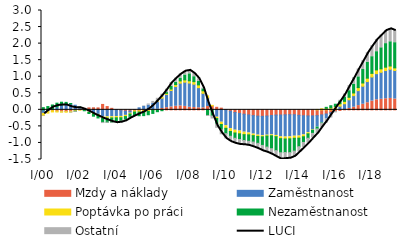
| Category | Mzdy a náklady | Zaměstnanost | Poptávka po práci | Nezaměstnanost | Ostatní |
|---|---|---|---|---|---|
| I/00 | -0.017 | -0.091 | -0.065 | 0.066 | -0.016 |
| II | -0.021 | -0.03 | -0.048 | 0.099 | -0.005 |
| III | -0.028 | 0.031 | -0.035 | 0.115 | 0.001 |
| IV | -0.037 | 0.092 | -0.029 | 0.11 | -0.005 |
| I/01 | -0.046 | 0.15 | -0.025 | 0.081 | -0.014 |
| II | -0.049 | 0.188 | -0.023 | 0.037 | -0.008 |
| III | -0.045 | 0.177 | -0.022 | 0.014 | -0.031 |
| IV | -0.022 | 0.139 | -0.016 | -0.007 | -0.029 |
| I/02 | 0.016 | 0.057 | -0.008 | 0.008 | -0.013 |
| II | 0.043 | -0.012 | -0.007 | -0.009 | -0.002 |
| III | 0.059 | -0.069 | -0.009 | -0.034 | 0.005 |
| IV | 0.063 | -0.11 | -0.016 | -0.065 | 0.006 |
| I/03 | 0.058 | -0.139 | -0.023 | -0.083 | -0.001 |
| II | 0.163 | -0.212 | -0.046 | -0.122 | -0.034 |
| III | 0.099 | -0.212 | -0.04 | -0.124 | -0.03 |
| IV | 0.045 | -0.21 | -0.036 | -0.128 | -0.026 |
| I/04 | 0.003 | -0.203 | -0.038 | -0.116 | -0.034 |
| II | -0.025 | -0.174 | -0.041 | -0.098 | -0.035 |
| III | -0.039 | -0.129 | -0.037 | -0.094 | -0.03 |
| IV | -0.039 | -0.065 | -0.025 | -0.096 | -0.023 |
| I/05 | -0.034 | 0.008 | -0.032 | -0.105 | -0.015 |
| II | -0.031 | 0.061 | -0.035 | -0.112 | 0.001 |
| III | -0.026 | 0.103 | -0.038 | -0.111 | 0.016 |
| IV | -0.016 | 0.141 | -0.032 | -0.101 | 0.036 |
| I/06 | 0.002 | 0.189 | -0.011 | -0.098 | 0.063 |
| II | 0.017 | 0.242 | 0.007 | -0.056 | 0.082 |
| III | 0.04 | 0.314 | 0.022 | -0.026 | 0.096 |
| IV | 0.065 | 0.4 | 0.034 | 0.022 | 0.105 |
| I/07 | 0.088 | 0.495 | 0.045 | 0.079 | 0.114 |
| II | 0.108 | 0.596 | 0.059 | 0.072 | 0.124 |
| III | 0.118 | 0.687 | 0.068 | 0.084 | 0.124 |
| IV | 0.104 | 0.732 | 0.068 | 0.149 | 0.116 |
| I/08 | 0.078 | 0.731 | 0.068 | 0.21 | 0.104 |
| II | 0.069 | 0.705 | 0.078 | 0.149 | 0.092 |
| III | 0.061 | 0.608 | 0.083 | 0.114 | 0.072 |
| IV | 0.061 | 0.439 | 0.076 | 0.058 | 0.025 |
| I/09 | 0.1 | 0.26 | 0.062 | -0.17 | -0.031 |
| II | 0.104 | 0.018 | 0.013 | -0.185 | -0.092 |
| III | 0.076 | -0.222 | -0.041 | -0.162 | -0.133 |
| IV | 0.051 | -0.374 | -0.068 | -0.16 | -0.151 |
| I/10 | 0.01 | -0.478 | -0.079 | -0.161 | -0.163 |
| II | -0.043 | -0.527 | -0.085 | -0.144 | -0.163 |
| III | -0.082 | -0.533 | -0.084 | -0.16 | -0.155 |
| IV | -0.108 | -0.532 | -0.084 | -0.172 | -0.151 |
| I/11 | -0.132 | -0.543 | -0.075 | -0.176 | -0.129 |
| II | -0.154 | -0.545 | -0.057 | -0.194 | -0.127 |
| III | -0.175 | -0.558 | -0.047 | -0.194 | -0.148 |
| IV | -0.189 | -0.574 | -0.039 | -0.209 | -0.163 |
| I/12 | -0.197 | -0.585 | -0.033 | -0.26 | -0.167 |
| II | -0.187 | -0.579 | -0.026 | -0.333 | -0.159 |
| III | -0.172 | -0.585 | -0.028 | -0.391 | -0.171 |
| IV | -0.159 | -0.615 | -0.037 | -0.423 | -0.187 |
| I/13 | -0.157 | -0.659 | -0.054 | -0.427 | -0.193 |
| II | -0.151 | -0.671 | -0.058 | -0.409 | -0.183 |
| III | -0.147 | -0.668 | -0.06 | -0.417 | -0.168 |
| IV | -0.148 | -0.649 | -0.061 | -0.389 | -0.154 |
| I/14 | -0.165 | -0.627 | -0.064 | -0.259 | -0.158 |
| II | -0.179 | -0.579 | -0.056 | -0.171 | -0.154 |
| III | -0.185 | -0.506 | -0.035 | -0.134 | -0.145 |
| IV | -0.183 | -0.425 | -0.01 | -0.094 | -0.137 |
| I/15 | -0.177 | -0.345 | 0.011 | -0.056 | -0.136 |
| II | -0.153 | -0.242 | 0.032 | -0.012 | -0.132 |
| III | -0.126 | -0.153 | 0.047 | 0.029 | -0.124 |
| IV | -0.089 | -0.061 | 0.061 | 0.063 | -0.096 |
| I/16 | -0.049 | 0.033 | 0.07 | 0.066 | -0.043 |
| II | -0.018 | 0.111 | 0.073 | 0.082 | 0.023 |
| III | 0.008 | 0.176 | 0.072 | 0.132 | 0.089 |
| IV | 0.042 | 0.262 | 0.076 | 0.2 | 0.153 |
| I/17 | 0.08 | 0.349 | 0.081 | 0.265 | 0.199 |
| II | 0.128 | 0.452 | 0.092 | 0.325 | 0.238 |
| III | 0.168 | 0.546 | 0.097 | 0.407 | 0.263 |
| IV | 0.214 | 0.639 | 0.103 | 0.483 | 0.29 |
| I/18 | 0.264 | 0.728 | 0.109 | 0.504 | 0.328 |
| II | 0.303 | 0.79 | 0.112 | 0.552 | 0.366 |
| III | 0.319 | 0.815 | 0.104 | 0.636 | 0.385 |
| IV | 0.334 | 0.852 | 0.101 | 0.712 | 0.396 |
| I/19 | 0.344 | 0.881 | 0.098 | 0.733 | 0.39 |
| II | 0.327 | 0.861 | 0.08 | 0.761 | 0.361 |